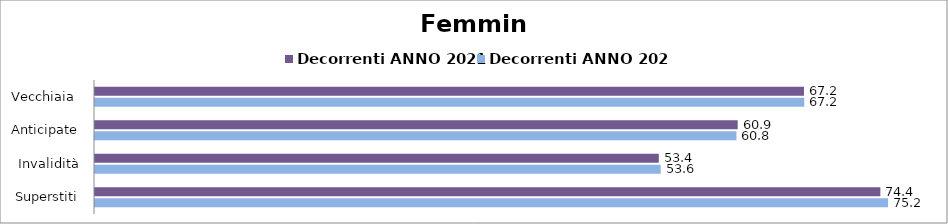
| Category | Decorrenti ANNO 2021 | Decorrenti ANNO 2022 |
|---|---|---|
| Vecchiaia  | 67.2 | 67.23 |
| Anticipate | 60.92 | 60.8 |
| Invalidità | 53.44 | 53.62 |
| Superstiti | 74.44 | 75.17 |